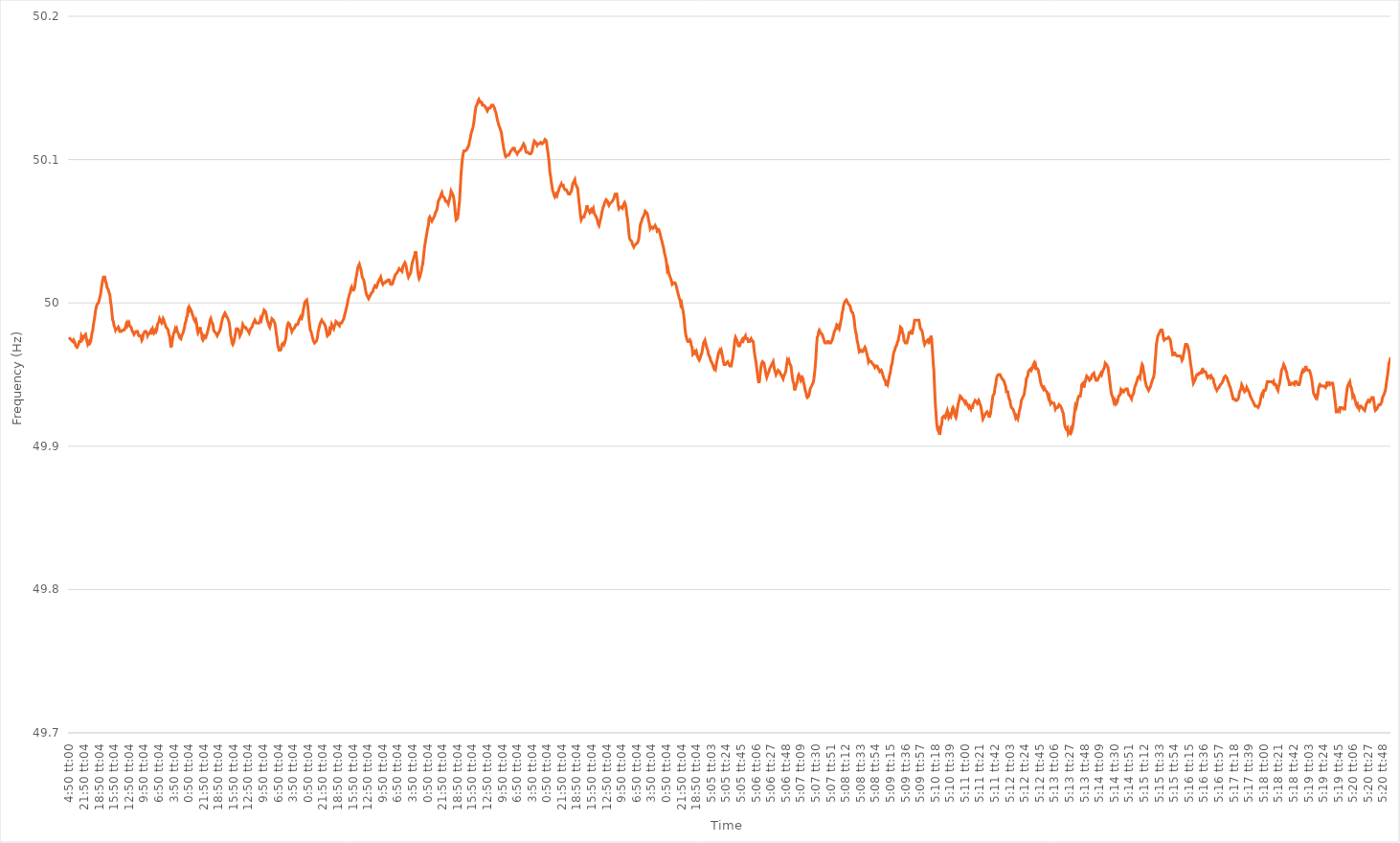
| Category | Series 0 |
|---|---|
| 0.20138888888888887 | 49.976 |
| 0.20140046296296296 | 49.975 |
| 0.20141203703703703 | 49.975 |
| 0.2014236111111111 | 49.974 |
| 0.2014351851851852 | 49.974 |
| 0.243101851851852 | 49.973 |
| 0.284768518518519 | 49.974 |
| 0.326435185185185 | 49.973 |
| 0.368101851851852 | 49.972 |
| 0.409768518518519 | 49.97 |
| 0.451435185185185 | 49.97 |
| 0.493101851851852 | 49.969 |
| 0.534768518518518 | 49.97 |
| 0.576435185185185 | 49.971 |
| 0.618101851851852 | 49.973 |
| 0.659768518518518 | 49.973 |
| 0.701435185185185 | 49.973 |
| 0.743101851851852 | 49.977 |
| 0.784768518518519 | 49.976 |
| 0.826435185185185 | 49.975 |
| 0.868101851851852 | 49.976 |
| 0.909768518518519 | 49.977 |
| 0.951435185185185 | 49.977 |
| 0.993101851851852 | 49.978 |
| 1900-01-01 00:50:04 | 49.975 |
| 1900-01-01 01:50:04 | 49.973 |
| 1900-01-01 02:50:04 | 49.971 |
| 1900-01-01 03:50:04 | 49.971 |
| 1900-01-01 04:50:04 | 49.973 |
| 1900-01-01 05:50:04 | 49.972 |
| 1900-01-01 06:50:04 | 49.973 |
| 1900-01-01 07:50:04 | 49.976 |
| 1900-01-01 08:50:04 | 49.979 |
| 1900-01-01 09:50:04 | 49.981 |
| 1900-01-01 10:50:04 | 49.985 |
| 1900-01-01 11:50:04 | 49.988 |
| 1900-01-01 12:50:04 | 49.991 |
| 1900-01-01 13:50:04 | 49.995 |
| 1900-01-01 14:50:04 | 49.997 |
| 1900-01-01 15:50:04 | 49.999 |
| 1900-01-01 16:50:04 | 49.999 |
| 1900-01-01 17:50:04 | 50 |
| 1900-01-01 18:50:04 | 50.002 |
| 1900-01-01 19:50:04 | 50.002 |
| 1900-01-01 20:50:04 | 50.006 |
| 1900-01-01 21:50:04 | 50.01 |
| 1900-01-01 22:50:04 | 50.013 |
| 1900-01-01 23:50:04 | 50.016 |
| 1900-01-02 00:50:04 | 50.018 |
| 1900-01-02 01:50:04 | 50.018 |
| 1900-01-02 02:50:04 | 50.018 |
| 1900-01-02 03:50:04 | 50.015 |
| 1900-01-02 04:50:04 | 50.014 |
| 1900-01-02 05:50:04 | 50.011 |
| 1900-01-02 06:50:04 | 50.01 |
| 1900-01-02 07:50:04 | 50.009 |
| 1900-01-02 08:50:04 | 50.007 |
| 1900-01-02 09:50:04 | 50.006 |
| 1900-01-02 10:50:04 | 50.001 |
| 1900-01-02 11:50:04 | 49.998 |
| 1900-01-02 12:50:04 | 49.993 |
| 1900-01-02 13:50:04 | 49.988 |
| 1900-01-02 14:50:04 | 49.987 |
| 1900-01-02 15:50:04 | 49.984 |
| 1900-01-02 16:50:04 | 49.983 |
| 1900-01-02 17:50:04 | 49.981 |
| 1900-01-02 18:50:04 | 49.982 |
| 1900-01-02 19:50:04 | 49.982 |
| 1900-01-02 20:50:04 | 49.982 |
| 1900-01-02 21:50:04 | 49.983 |
| 1900-01-02 22:50:04 | 49.982 |
| 1900-01-02 23:50:04 | 49.98 |
| 1900-01-03 00:50:04 | 49.98 |
| 1900-01-03 01:50:04 | 49.98 |
| 1900-01-03 02:50:04 | 49.98 |
| 1900-01-03 03:50:04 | 49.981 |
| 1900-01-03 04:50:04 | 49.981 |
| 1900-01-03 05:50:04 | 49.981 |
| 1900-01-03 06:50:04 | 49.982 |
| 1900-01-03 07:50:04 | 49.983 |
| 1900-01-03 08:50:04 | 49.985 |
| 1900-01-03 09:50:04 | 49.984 |
| 1900-01-03 10:50:04 | 49.986 |
| 1900-01-03 11:50:04 | 49.985 |
| 1900-01-03 12:50:04 | 49.986 |
| 1900-01-03 13:50:04 | 49.984 |
| 1900-01-03 14:50:04 | 49.984 |
| 1900-01-03 15:50:04 | 49.983 |
| 1900-01-03 16:50:04 | 49.981 |
| 1900-01-03 17:50:04 | 49.981 |
| 1900-01-03 18:50:04 | 49.979 |
| 1900-01-03 19:50:04 | 49.978 |
| 1900-01-03 20:50:04 | 49.979 |
| 1900-01-03 21:50:04 | 49.979 |
| 1900-01-03 22:50:04 | 49.98 |
| 1900-01-03 23:50:04 | 49.98 |
| 1900-01-04 00:50:04 | 49.98 |
| 1900-01-04 01:50:04 | 49.978 |
| 1900-01-04 02:50:04 | 49.977 |
| 1900-01-04 03:50:04 | 49.977 |
| 1900-01-04 04:50:04 | 49.977 |
| 1900-01-04 05:50:04 | 49.976 |
| 1900-01-04 06:50:04 | 49.974 |
| 1900-01-04 07:50:04 | 49.975 |
| 1900-01-04 08:50:04 | 49.978 |
| 1900-01-04 09:50:04 | 49.978 |
| 1900-01-04 10:50:04 | 49.98 |
| 1900-01-04 11:50:04 | 49.98 |
| 1900-01-04 12:50:04 | 49.98 |
| 1900-01-04 13:50:04 | 49.979 |
| 1900-01-04 14:50:04 | 49.977 |
| 1900-01-04 15:50:04 | 49.978 |
| 1900-01-04 16:50:04 | 49.978 |
| 1900-01-04 17:50:04 | 49.979 |
| 1900-01-04 18:50:04 | 49.98 |
| 1900-01-04 19:50:04 | 49.978 |
| 1900-01-04 20:50:04 | 49.981 |
| 1900-01-04 21:50:04 | 49.982 |
| 1900-01-04 22:50:04 | 49.98 |
| 1900-01-04 23:50:04 | 49.979 |
| 1900-01-05 00:50:04 | 49.979 |
| 1900-01-05 01:50:04 | 49.981 |
| 1900-01-05 02:50:04 | 49.98 |
| 1900-01-05 03:50:04 | 49.981 |
| 1900-01-05 04:50:04 | 49.985 |
| 1900-01-05 05:50:04 | 49.985 |
| 1900-01-05 06:50:04 | 49.987 |
| 1900-01-05 07:50:04 | 49.989 |
| 1900-01-05 08:50:04 | 49.988 |
| 1900-01-05 09:50:04 | 49.987 |
| 1900-01-05 10:50:04 | 49.986 |
| 1900-01-05 11:50:04 | 49.987 |
| 1900-01-05 12:50:04 | 49.989 |
| 1900-01-05 13:50:04 | 49.988 |
| 1900-01-05 14:50:04 | 49.986 |
| 1900-01-05 15:50:04 | 49.985 |
| 1900-01-05 16:50:04 | 49.983 |
| 1900-01-05 17:50:04 | 49.983 |
| 1900-01-05 18:50:04 | 49.982 |
| 1900-01-05 19:50:04 | 49.981 |
| 1900-01-05 20:50:04 | 49.978 |
| 1900-01-05 21:50:04 | 49.977 |
| 1900-01-05 22:50:04 | 49.973 |
| 1900-01-05 23:50:04 | 49.969 |
| 1900-01-06 00:50:04 | 49.971 |
| 1900-01-06 01:50:04 | 49.974 |
| 1900-01-06 02:50:04 | 49.977 |
| 1900-01-06 03:50:04 | 49.979 |
| 1900-01-06 04:50:04 | 49.98 |
| 1900-01-06 05:50:04 | 49.982 |
| 1900-01-06 06:50:04 | 49.981 |
| 1900-01-06 07:50:04 | 49.982 |
| 1900-01-06 08:50:04 | 49.98 |
| 1900-01-06 09:50:04 | 49.979 |
| 1900-01-06 10:50:04 | 49.978 |
| 1900-01-06 11:50:04 | 49.976 |
| 1900-01-06 12:50:04 | 49.976 |
| 1900-01-06 13:50:04 | 49.975 |
| 1900-01-06 14:50:04 | 49.977 |
| 1900-01-06 15:50:04 | 49.978 |
| 1900-01-06 16:50:04 | 49.979 |
| 1900-01-06 17:50:04 | 49.981 |
| 1900-01-06 18:50:04 | 49.983 |
| 1900-01-06 19:50:04 | 49.986 |
| 1900-01-06 20:50:04 | 49.987 |
| 1900-01-06 21:50:04 | 49.99 |
| 1900-01-06 22:50:04 | 49.991 |
| 1900-01-06 23:50:04 | 49.996 |
| 1900-01-07 00:50:04 | 49.997 |
| 1900-01-07 01:50:04 | 49.995 |
| 1900-01-07 02:50:04 | 49.996 |
| 1900-01-07 03:50:04 | 49.995 |
| 1900-01-07 04:50:04 | 49.994 |
| 1900-01-07 05:50:04 | 49.992 |
| 1900-01-07 06:50:04 | 49.991 |
| 1900-01-07 07:50:04 | 49.989 |
| 1900-01-07 08:50:04 | 49.989 |
| 1900-01-07 09:50:04 | 49.987 |
| 1900-01-07 10:50:04 | 49.988 |
| 1900-01-07 11:50:04 | 49.986 |
| 1900-01-07 12:50:04 | 49.981 |
| 1900-01-07 13:50:04 | 49.979 |
| 1900-01-07 14:50:04 | 49.98 |
| 1900-01-07 15:50:04 | 49.98 |
| 1900-01-07 16:50:04 | 49.983 |
| 1900-01-07 17:50:04 | 49.98 |
| 1900-01-07 18:50:04 | 49.979 |
| 1900-01-07 19:50:04 | 49.975 |
| 1900-01-07 20:50:04 | 49.974 |
| 1900-01-07 21:50:04 | 49.975 |
| 1900-01-07 22:50:04 | 49.977 |
| 1900-01-07 23:50:04 | 49.977 |
| 1900-01-08 00:50:04 | 49.976 |
| 1900-01-08 01:50:04 | 49.976 |
| 1900-01-08 02:50:04 | 49.979 |
| 1900-01-08 03:50:04 | 49.979 |
| 1900-01-08 04:50:04 | 49.983 |
| 1900-01-08 05:50:04 | 49.985 |
| 1900-01-08 06:50:04 | 49.988 |
| 1900-01-08 07:50:04 | 49.989 |
| 1900-01-08 08:50:04 | 49.987 |
| 1900-01-08 09:50:04 | 49.986 |
| 1900-01-08 10:50:04 | 49.985 |
| 1900-01-08 11:50:04 | 49.981 |
| 1900-01-08 12:50:04 | 49.98 |
| 1900-01-08 13:50:04 | 49.98 |
| 1900-01-08 14:50:04 | 49.979 |
| 1900-01-08 15:50:04 | 49.978 |
| 1900-01-08 16:50:04 | 49.977 |
| 1900-01-08 17:50:04 | 49.978 |
| 1900-01-08 18:50:04 | 49.978 |
| 1900-01-08 19:50:04 | 49.98 |
| 1900-01-08 20:50:04 | 49.981 |
| 1900-01-08 21:50:04 | 49.983 |
| 1900-01-08 22:50:04 | 49.986 |
| 1900-01-08 23:50:04 | 49.988 |
| 1900-01-09 00:50:04 | 49.99 |
| 1900-01-09 01:50:04 | 49.991 |
| 1900-01-09 02:50:04 | 49.992 |
| 1900-01-09 03:50:04 | 49.99 |
| 1900-01-09 04:50:04 | 49.992 |
| 1900-01-09 05:50:04 | 49.992 |
| 1900-01-09 06:50:04 | 49.99 |
| 1900-01-09 07:50:04 | 49.989 |
| 1900-01-09 08:50:04 | 49.989 |
| 1900-01-09 09:50:04 | 49.986 |
| 1900-01-09 10:50:04 | 49.982 |
| 1900-01-09 11:50:04 | 49.977 |
| 1900-01-09 12:50:04 | 49.975 |
| 1900-01-09 13:50:04 | 49.972 |
| 1900-01-09 14:50:04 | 49.971 |
| 1900-01-09 15:50:04 | 49.972 |
| 1900-01-09 16:50:04 | 49.974 |
| 1900-01-09 17:50:04 | 49.977 |
| 1900-01-09 18:50:04 | 49.979 |
| 1900-01-09 19:50:04 | 49.982 |
| 1900-01-09 20:50:04 | 49.982 |
| 1900-01-09 21:50:04 | 49.982 |
| 1900-01-09 22:50:04 | 49.981 |
| 1900-01-09 23:50:04 | 49.98 |
| 1900-01-10 00:50:04 | 49.977 |
| 1900-01-10 01:50:04 | 49.977 |
| 1900-01-10 02:50:04 | 49.979 |
| 1900-01-10 03:50:04 | 49.982 |
| 1900-01-10 04:50:04 | 49.985 |
| 1900-01-10 05:50:04 | 49.984 |
| 1900-01-10 06:50:04 | 49.983 |
| 1900-01-10 07:50:04 | 49.983 |
| 1900-01-10 08:50:04 | 49.983 |
| 1900-01-10 09:50:04 | 49.982 |
| 1900-01-10 10:50:04 | 49.982 |
| 1900-01-10 11:50:04 | 49.981 |
| 1900-01-10 12:50:04 | 49.98 |
| 1900-01-10 13:50:04 | 49.979 |
| 1900-01-10 14:50:04 | 49.979 |
| 1900-01-10 15:50:04 | 49.982 |
| 1900-01-10 16:50:04 | 49.982 |
| 1900-01-10 17:50:04 | 49.983 |
| 1900-01-10 18:50:04 | 49.985 |
| 1900-01-10 19:50:04 | 49.986 |
| 1900-01-10 20:50:04 | 49.987 |
| 1900-01-10 21:50:04 | 49.988 |
| 1900-01-10 22:50:04 | 49.988 |
| 1900-01-10 23:50:04 | 49.986 |
| 1900-01-11 00:50:04 | 49.986 |
| 1900-01-11 01:50:04 | 49.986 |
| 1900-01-11 02:50:04 | 49.986 |
| 1900-01-11 03:50:04 | 49.986 |
| 1900-01-11 04:50:04 | 49.987 |
| 1900-01-11 05:50:04 | 49.989 |
| 1900-01-11 06:50:04 | 49.988 |
| 1900-01-11 07:50:04 | 49.99 |
| 1900-01-11 08:50:04 | 49.992 |
| 1900-01-11 09:50:04 | 49.993 |
| 1900-01-11 10:50:04 | 49.995 |
| 1900-01-11 11:50:04 | 49.995 |
| 1900-01-11 12:50:04 | 49.994 |
| 1900-01-11 13:50:04 | 49.992 |
| 1900-01-11 14:50:04 | 49.989 |
| 1900-01-11 15:50:04 | 49.987 |
| 1900-01-11 16:50:04 | 49.986 |
| 1900-01-11 17:50:04 | 49.984 |
| 1900-01-11 18:50:04 | 49.983 |
| 1900-01-11 19:50:04 | 49.985 |
| 1900-01-11 20:50:04 | 49.987 |
| 1900-01-11 21:50:04 | 49.989 |
| 1900-01-11 22:50:04 | 49.989 |
| 1900-01-11 23:50:04 | 49.988 |
| 1900-01-12 00:50:04 | 49.987 |
| 1900-01-12 01:50:04 | 49.986 |
| 1900-01-12 02:50:04 | 49.983 |
| 1900-01-12 03:50:04 | 49.979 |
| 1900-01-12 04:50:04 | 49.976 |
| 1900-01-12 05:50:04 | 49.971 |
| 1900-01-12 06:50:04 | 49.969 |
| 1900-01-12 07:50:04 | 49.967 |
| 1900-01-12 08:50:04 | 49.967 |
| 1900-01-12 09:50:04 | 49.967 |
| 1900-01-12 10:50:04 | 49.968 |
| 1900-01-12 11:50:04 | 49.971 |
| 1900-01-12 12:50:04 | 49.971 |
| 1900-01-12 13:50:04 | 49.972 |
| 1900-01-12 14:50:04 | 49.971 |
| 1900-01-12 15:50:04 | 49.972 |
| 1900-01-12 16:50:04 | 49.974 |
| 1900-01-12 17:50:04 | 49.977 |
| 1900-01-12 18:50:04 | 49.982 |
| 1900-01-12 19:50:04 | 49.985 |
| 1900-01-12 20:50:04 | 49.986 |
| 1900-01-12 21:50:04 | 49.986 |
| 1900-01-12 22:50:04 | 49.985 |
| 1900-01-12 23:50:04 | 49.983 |
| 1900-01-13 00:50:04 | 49.982 |
| 1900-01-13 01:50:04 | 49.98 |
| 1900-01-13 02:50:04 | 49.981 |
| 1900-01-13 03:50:04 | 49.981 |
| 1900-01-13 04:50:04 | 49.982 |
| 1900-01-13 05:50:04 | 49.982 |
| 1900-01-13 06:50:04 | 49.984 |
| 1900-01-13 07:50:04 | 49.985 |
| 1900-01-13 08:50:04 | 49.985 |
| 1900-01-13 09:50:04 | 49.985 |
| 1900-01-13 10:50:04 | 49.986 |
| 1900-01-13 11:50:04 | 49.988 |
| 1900-01-13 12:50:04 | 49.989 |
| 1900-01-13 13:50:04 | 49.99 |
| 1900-01-13 14:50:04 | 49.988 |
| 1900-01-13 15:50:04 | 49.99 |
| 1900-01-13 16:50:04 | 49.991 |
| 1900-01-13 17:50:04 | 49.995 |
| 1900-01-13 18:50:04 | 49.997 |
| 1900-01-13 19:50:04 | 50 |
| 1900-01-13 20:50:04 | 50.001 |
| 1900-01-13 21:50:04 | 50.001 |
| 1900-01-13 22:50:04 | 50.002 |
| 1900-01-13 23:50:04 | 49.999 |
| 1900-01-14 00:50:04 | 49.995 |
| 1900-01-14 01:50:04 | 49.989 |
| 1900-01-14 02:50:04 | 49.985 |
| 1900-01-14 03:50:04 | 49.981 |
| 1900-01-14 04:50:04 | 49.98 |
| 1900-01-14 05:50:04 | 49.978 |
| 1900-01-14 06:50:04 | 49.976 |
| 1900-01-14 07:50:04 | 49.974 |
| 1900-01-14 08:50:04 | 49.973 |
| 1900-01-14 09:50:04 | 49.972 |
| 1900-01-14 10:50:04 | 49.972 |
| 1900-01-14 11:50:04 | 49.973 |
| 1900-01-14 12:50:04 | 49.974 |
| 1900-01-14 13:50:04 | 49.976 |
| 1900-01-14 14:50:04 | 49.98 |
| 1900-01-14 15:50:04 | 49.982 |
| 1900-01-14 16:50:04 | 49.984 |
| 1900-01-14 17:50:04 | 49.986 |
| 1900-01-14 18:50:04 | 49.987 |
| 1900-01-14 19:50:04 | 49.988 |
| 1900-01-14 20:50:04 | 49.987 |
| 1900-01-14 21:50:04 | 49.987 |
| 1900-01-14 22:50:04 | 49.986 |
| 1900-01-14 23:50:04 | 49.985 |
| 1900-01-15 00:50:04 | 49.984 |
| 1900-01-15 01:50:04 | 49.982 |
| 1900-01-15 02:50:04 | 49.979 |
| 1900-01-15 03:50:04 | 49.977 |
| 1900-01-15 04:50:04 | 49.977 |
| 1900-01-15 05:50:04 | 49.978 |
| 1900-01-15 06:50:04 | 49.981 |
| 1900-01-15 07:50:04 | 49.98 |
| 1900-01-15 08:50:04 | 49.982 |
| 1900-01-15 09:50:04 | 49.985 |
| 1900-01-15 10:50:04 | 49.984 |
| 1900-01-15 11:50:04 | 49.983 |
| 1900-01-15 12:50:04 | 49.982 |
| 1900-01-15 13:50:04 | 49.984 |
| 1900-01-15 14:50:04 | 49.985 |
| 1900-01-15 15:50:04 | 49.987 |
| 1900-01-15 16:50:04 | 49.987 |
| 1900-01-15 17:50:04 | 49.986 |
| 1900-01-15 18:50:04 | 49.985 |
| 1900-01-15 19:50:04 | 49.985 |
| 1900-01-15 20:50:04 | 49.984 |
| 1900-01-15 21:50:04 | 49.986 |
| 1900-01-15 22:50:04 | 49.986 |
| 1900-01-15 23:50:04 | 49.986 |
| 1900-01-16 00:50:04 | 49.986 |
| 1900-01-16 01:50:04 | 49.988 |
| 1900-01-16 02:50:04 | 49.989 |
| 1900-01-16 03:50:04 | 49.991 |
| 1900-01-16 04:50:04 | 49.993 |
| 1900-01-16 05:50:04 | 49.995 |
| 1900-01-16 06:50:04 | 49.997 |
| 1900-01-16 07:50:04 | 49.999 |
| 1900-01-16 08:50:04 | 50.002 |
| 1900-01-16 09:50:04 | 50.004 |
| 1900-01-16 10:50:04 | 50.006 |
| 1900-01-16 11:50:04 | 50.007 |
| 1900-01-16 12:50:04 | 50.01 |
| 1900-01-16 13:50:04 | 50.011 |
| 1900-01-16 14:50:04 | 50.009 |
| 1900-01-16 15:50:04 | 50.009 |
| 1900-01-16 16:50:04 | 50.009 |
| 1900-01-16 17:50:04 | 50.01 |
| 1900-01-16 18:50:04 | 50.013 |
| 1900-01-16 19:50:04 | 50.017 |
| 1900-01-16 20:50:04 | 50.019 |
| 1900-01-16 21:50:04 | 50.022 |
| 1900-01-16 22:50:04 | 50.025 |
| 1900-01-16 23:50:04 | 50.026 |
| 1900-01-17 00:50:04 | 50.027 |
| 1900-01-17 01:50:04 | 50.025 |
| 1900-01-17 02:50:04 | 50.024 |
| 1900-01-17 03:50:04 | 50.021 |
| 1900-01-17 04:50:04 | 50.018 |
| 1900-01-17 05:50:04 | 50.018 |
| 1900-01-17 06:50:04 | 50.016 |
| 1900-01-17 07:50:04 | 50.014 |
| 1900-01-17 08:50:04 | 50.011 |
| 1900-01-17 09:50:04 | 50.008 |
| 1900-01-17 10:50:04 | 50.006 |
| 1900-01-17 11:50:04 | 50.005 |
| 1900-01-17 12:50:04 | 50.005 |
| 1900-01-17 13:50:04 | 50.003 |
| 1900-01-17 14:50:04 | 50.004 |
| 1900-01-17 15:50:04 | 50.005 |
| 1900-01-17 16:50:04 | 50.006 |
| 1900-01-17 17:50:04 | 50.007 |
| 1900-01-17 18:50:04 | 50.007 |
| 1900-01-17 19:50:04 | 50.008 |
| 1900-01-17 20:50:04 | 50.01 |
| 1900-01-17 21:50:04 | 50.011 |
| 1900-01-17 22:50:04 | 50.012 |
| 1900-01-17 23:50:04 | 50.012 |
| 1900-01-18 00:50:04 | 50.011 |
| 1900-01-18 01:50:04 | 50.012 |
| 1900-01-18 02:50:04 | 50.014 |
| 1900-01-18 03:50:04 | 50.015 |
| 1900-01-18 04:50:04 | 50.016 |
| 1900-01-18 05:50:04 | 50.017 |
| 1900-01-18 06:50:04 | 50.018 |
| 1900-01-18 07:50:04 | 50.016 |
| 1900-01-18 08:50:04 | 50.014 |
| 1900-01-18 09:50:04 | 50.013 |
| 1900-01-18 10:50:04 | 50.014 |
| 1900-01-18 11:50:04 | 50.014 |
| 1900-01-18 12:50:04 | 50.014 |
| 1900-01-18 13:50:04 | 50.015 |
| 1900-01-18 14:50:04 | 50.015 |
| 1900-01-18 15:50:04 | 50.015 |
| 1900-01-18 16:50:04 | 50.016 |
| 1900-01-18 17:50:04 | 50.016 |
| 1900-01-18 18:50:04 | 50.016 |
| 1900-01-18 19:50:04 | 50.016 |
| 1900-01-18 20:50:04 | 50.013 |
| 1900-01-18 21:50:04 | 50.013 |
| 1900-01-18 22:50:04 | 50.013 |
| 1900-01-18 23:50:04 | 50.014 |
| 1900-01-19 00:50:04 | 50.016 |
| 1900-01-19 01:50:04 | 50.017 |
| 1900-01-19 02:50:04 | 50.019 |
| 1900-01-19 03:50:04 | 50.02 |
| 1900-01-19 04:50:04 | 50.02 |
| 1900-01-19 05:50:04 | 50.021 |
| 1900-01-19 06:50:04 | 50.022 |
| 1900-01-19 07:50:04 | 50.023 |
| 1900-01-19 08:50:04 | 50.024 |
| 1900-01-19 09:50:04 | 50.024 |
| 1900-01-19 10:50:04 | 50.023 |
| 1900-01-19 11:50:04 | 50.023 |
| 1900-01-19 12:50:04 | 50.022 |
| 1900-01-19 13:50:04 | 50.025 |
| 1900-01-19 14:50:04 | 50.025 |
| 1900-01-19 15:50:04 | 50.027 |
| 1900-01-19 16:50:04 | 50.028 |
| 1900-01-19 17:50:04 | 50.027 |
| 1900-01-19 18:50:04 | 50.025 |
| 1900-01-19 19:50:04 | 50.022 |
| 1900-01-19 20:50:04 | 50.02 |
| 1900-01-19 21:50:04 | 50.018 |
| 1900-01-19 22:50:04 | 50.019 |
| 1900-01-19 23:50:04 | 50.019 |
| 1900-01-20 00:50:04 | 50.021 |
| 1900-01-20 01:50:04 | 50.024 |
| 1900-01-20 02:50:04 | 50.027 |
| 1900-01-20 03:50:04 | 50.029 |
| 1900-01-20 04:50:04 | 50.029 |
| 1900-01-20 05:50:04 | 50.032 |
| 1900-01-20 06:50:04 | 50.034 |
| 1900-01-20 07:50:04 | 50.036 |
| 1900-01-20 08:50:04 | 50.033 |
| 1900-01-20 09:50:04 | 50.029 |
| 1900-01-20 10:50:04 | 50.023 |
| 1900-01-20 11:50:04 | 50.019 |
| 1900-01-20 12:50:04 | 50.017 |
| 1900-01-20 13:50:04 | 50.018 |
| 1900-01-20 14:50:04 | 50.02 |
| 1900-01-20 15:50:04 | 50.022 |
| 1900-01-20 16:50:04 | 50.025 |
| 1900-01-20 17:50:04 | 50.027 |
| 1900-01-20 18:50:04 | 50.031 |
| 1900-01-20 19:50:04 | 50.036 |
| 1900-01-20 20:50:04 | 50.04 |
| 1900-01-20 21:50:04 | 50.043 |
| 1900-01-20 22:50:04 | 50.046 |
| 1900-01-20 23:50:04 | 50.049 |
| 1900-01-21 00:50:04 | 50.052 |
| 1900-01-21 01:50:04 | 50.054 |
| 1900-01-21 02:50:04 | 50.059 |
| 1900-01-21 03:50:04 | 50.06 |
| 1900-01-21 04:50:04 | 50.059 |
| 1900-01-21 05:50:04 | 50.059 |
| 1900-01-21 06:50:04 | 50.057 |
| 1900-01-21 07:50:04 | 50.058 |
| 1900-01-21 08:50:04 | 50.059 |
| 1900-01-21 09:50:04 | 50.06 |
| 1900-01-21 10:50:04 | 50.061 |
| 1900-01-21 11:50:04 | 50.063 |
| 1900-01-21 12:50:04 | 50.064 |
| 1900-01-21 13:50:04 | 50.065 |
| 1900-01-21 14:50:04 | 50.068 |
| 1900-01-21 15:50:04 | 50.071 |
| 1900-01-21 16:50:04 | 50.072 |
| 1900-01-21 17:50:04 | 50.073 |
| 1900-01-21 18:50:04 | 50.074 |
| 1900-01-21 19:50:04 | 50.076 |
| 1900-01-21 20:50:04 | 50.077 |
| 1900-01-21 21:50:04 | 50.075 |
| 1900-01-21 22:50:04 | 50.074 |
| 1900-01-21 23:50:04 | 50.074 |
| 1900-01-22 00:50:04 | 50.073 |
| 1900-01-22 01:50:04 | 50.071 |
| 1900-01-22 02:50:04 | 50.071 |
| 1900-01-22 03:50:04 | 50.071 |
| 1900-01-22 04:50:04 | 50.07 |
| 1900-01-22 05:50:04 | 50.069 |
| 1900-01-22 06:50:04 | 50.069 |
| 1900-01-22 07:50:04 | 50.073 |
| 1900-01-22 08:50:04 | 50.075 |
| 1900-01-22 09:50:04 | 50.078 |
| 1900-01-22 10:50:04 | 50.077 |
| 1900-01-22 11:50:04 | 50.077 |
| 1900-01-22 12:50:04 | 50.075 |
| 1900-01-22 13:50:04 | 50.072 |
| 1900-01-22 14:50:04 | 50.068 |
| 1900-01-22 15:50:04 | 50.062 |
| 1900-01-22 16:50:04 | 50.058 |
| 1900-01-22 17:50:04 | 50.058 |
| 1900-01-22 18:50:04 | 50.059 |
| 1900-01-22 19:50:04 | 50.062 |
| 1900-01-22 20:50:04 | 50.067 |
| 1900-01-22 21:50:04 | 50.072 |
| 1900-01-22 22:50:04 | 50.081 |
| 1900-01-22 23:50:04 | 50.09 |
| 1900-01-23 00:50:04 | 50.096 |
| 1900-01-23 01:50:04 | 50.101 |
| 1900-01-23 02:50:04 | 50.104 |
| 1900-01-23 03:50:04 | 50.106 |
| 1900-01-23 04:50:04 | 50.106 |
| 1900-01-23 05:50:04 | 50.106 |
| 1900-01-23 06:50:04 | 50.106 |
| 1900-01-23 07:50:04 | 50.107 |
| 1900-01-23 08:50:04 | 50.108 |
| 1900-01-23 09:50:04 | 50.109 |
| 1900-01-23 10:50:04 | 50.11 |
| 1900-01-23 11:50:04 | 50.113 |
| 1900-01-23 12:50:04 | 50.115 |
| 1900-01-23 13:50:04 | 50.118 |
| 1900-01-23 14:50:04 | 50.118 |
| 1900-01-23 15:50:04 | 50.121 |
| 1900-01-23 16:50:04 | 50.123 |
| 1900-01-23 17:50:04 | 50.126 |
| 1900-01-23 18:50:04 | 50.13 |
| 1900-01-23 19:50:04 | 50.134 |
| 1900-01-23 20:50:04 | 50.137 |
| 1900-01-23 21:50:04 | 50.138 |
| 1900-01-23 22:50:04 | 50.139 |
| 1900-01-23 23:50:04 | 50.141 |
| 1900-01-24 00:50:04 | 50.142 |
| 1900-01-24 01:50:04 | 50.141 |
| 1900-01-24 02:50:04 | 50.14 |
| 1900-01-24 03:50:04 | 50.14 |
| 1900-01-24 04:50:04 | 50.14 |
| 1900-01-24 05:50:04 | 50.138 |
| 1900-01-24 06:50:04 | 50.138 |
| 1900-01-24 07:50:04 | 50.138 |
| 1900-01-24 08:50:04 | 50.138 |
| 1900-01-24 09:50:04 | 50.137 |
| 1900-01-24 10:50:04 | 50.136 |
| 1900-01-24 11:50:04 | 50.135 |
| 1900-01-24 12:50:04 | 50.134 |
| 1900-01-24 13:50:04 | 50.135 |
| 1900-01-24 14:50:04 | 50.136 |
| 1900-01-24 15:50:04 | 50.136 |
| 1900-01-24 16:50:04 | 50.136 |
| 1900-01-24 17:50:04 | 50.137 |
| 1900-01-24 18:50:04 | 50.138 |
| 1900-01-24 19:50:04 | 50.138 |
| 1900-01-24 20:50:04 | 50.138 |
| 1900-01-24 21:50:04 | 50.138 |
| 1900-01-24 22:50:04 | 50.136 |
| 1900-01-24 23:50:04 | 50.134 |
| 1900-01-25 00:50:04 | 50.133 |
| 1900-01-25 01:50:04 | 50.133 |
| 1900-01-25 02:50:04 | 50.128 |
| 1900-01-25 03:50:04 | 50.126 |
| 1900-01-25 04:50:04 | 50.124 |
| 1900-01-25 05:50:04 | 50.123 |
| 1900-01-25 06:50:04 | 50.123 |
| 1900-01-25 07:50:04 | 50.12 |
| 1900-01-25 08:50:04 | 50.118 |
| 1900-01-25 09:50:04 | 50.114 |
| 1900-01-25 10:50:04 | 50.111 |
| 1900-01-25 11:50:04 | 50.108 |
| 1900-01-25 12:50:04 | 50.106 |
| 1900-01-25 13:50:04 | 50.103 |
| 1900-01-25 14:50:04 | 50.102 |
| 1900-01-25 15:50:04 | 50.102 |
| 1900-01-25 16:50:04 | 50.103 |
| 1900-01-25 17:50:04 | 50.103 |
| 1900-01-25 18:50:04 | 50.103 |
| 1900-01-25 19:50:04 | 50.104 |
| 1900-01-25 20:50:04 | 50.104 |
| 1900-01-25 21:50:04 | 50.106 |
| 1900-01-25 22:50:04 | 50.106 |
| 1900-01-25 23:50:04 | 50.107 |
| 1900-01-26 00:50:04 | 50.108 |
| 1900-01-26 01:50:04 | 50.108 |
| 1900-01-26 02:50:04 | 50.108 |
| 1900-01-26 03:50:04 | 50.106 |
| 1900-01-26 04:50:04 | 50.106 |
| 1900-01-26 05:50:04 | 50.105 |
| 1900-01-26 06:50:04 | 50.104 |
| 1900-01-26 07:50:04 | 50.105 |
| 1900-01-26 08:50:04 | 50.105 |
| 1900-01-26 09:50:04 | 50.106 |
| 1900-01-26 10:50:04 | 50.106 |
| 1900-01-26 11:50:04 | 50.107 |
| 1900-01-26 12:50:04 | 50.108 |
| 1900-01-26 13:50:04 | 50.109 |
| 1900-01-26 14:50:04 | 50.109 |
| 1900-01-26 15:50:04 | 50.111 |
| 1900-01-26 16:50:04 | 50.11 |
| 1900-01-26 17:50:04 | 50.109 |
| 1900-01-26 18:50:04 | 50.106 |
| 1900-01-26 19:50:04 | 50.105 |
| 1900-01-26 20:50:04 | 50.105 |
| 1900-01-26 21:50:04 | 50.105 |
| 1900-01-26 22:50:04 | 50.105 |
| 1900-01-26 23:50:04 | 50.104 |
| 1900-01-27 00:50:04 | 50.104 |
| 1900-01-27 01:50:04 | 50.104 |
| 1900-01-27 02:50:04 | 50.104 |
| 1900-01-27 03:50:04 | 50.106 |
| 1900-01-27 04:50:04 | 50.109 |
| 1900-01-27 05:50:04 | 50.111 |
| 1900-01-27 06:50:04 | 50.113 |
| 1900-01-27 07:50:04 | 50.113 |
| 1900-01-27 08:50:04 | 50.112 |
| 1900-01-27 09:50:04 | 50.112 |
| 1900-01-27 10:50:04 | 50.11 |
| 1900-01-27 11:50:04 | 50.111 |
| 1900-01-27 12:50:04 | 50.111 |
| 1900-01-27 13:50:04 | 50.111 |
| 1900-01-27 14:50:04 | 50.111 |
| 1900-01-27 15:50:04 | 50.112 |
| 1900-01-27 16:50:04 | 50.112 |
| 1900-01-27 17:50:04 | 50.111 |
| 1900-01-27 18:50:04 | 50.111 |
| 1900-01-27 19:50:04 | 50.112 |
| 1900-01-27 20:50:04 | 50.113 |
| 1900-01-27 21:50:04 | 50.114 |
| 1900-01-27 22:50:04 | 50.114 |
| 1900-01-27 23:50:04 | 50.113 |
| 1900-01-28 00:50:04 | 50.109 |
| 1900-01-28 01:50:04 | 50.109 |
| 1900-01-28 02:50:04 | 50.102 |
| 1900-01-28 03:50:04 | 50.097 |
| 1900-01-28 04:50:04 | 50.091 |
| 1900-01-28 05:50:04 | 50.088 |
| 1900-01-28 06:50:04 | 50.084 |
| 1900-01-28 07:50:04 | 50.081 |
| 1900-01-28 08:50:04 | 50.078 |
| 1900-01-28 09:50:04 | 50.077 |
| 1900-01-28 10:50:04 | 50.075 |
| 1900-01-28 11:50:04 | 50.074 |
| 1900-01-28 12:50:04 | 50.075 |
| 1900-01-28 13:50:04 | 50.076 |
| 1900-01-28 14:50:04 | 50.075 |
| 1900-01-28 15:50:04 | 50.077 |
| 1900-01-28 16:50:04 | 50.078 |
| 1900-01-28 17:50:04 | 50.08 |
| 1900-01-28 18:50:04 | 50.081 |
| 1900-01-28 19:50:04 | 50.082 |
| 1900-01-28 20:50:04 | 50.083 |
| 1900-01-28 21:50:04 | 50.081 |
| 1900-01-28 22:50:04 | 50.083 |
| 1900-01-28 23:50:04 | 50.081 |
| 1900-01-29 00:50:04 | 50.081 |
| 1900-01-29 01:50:04 | 50.079 |
| 1900-01-29 02:50:04 | 50.079 |
| 1900-01-29 03:50:04 | 50.079 |
| 1900-01-29 04:50:04 | 50.079 |
| 1900-01-29 05:50:04 | 50.077 |
| 1900-01-29 06:50:04 | 50.076 |
| 1900-01-29 07:50:04 | 50.076 |
| 1900-01-29 08:50:04 | 50.076 |
| 1900-01-29 09:50:04 | 50.076 |
| 1900-01-29 10:50:04 | 50.078 |
| 1900-01-29 11:50:04 | 50.08 |
| 1900-01-29 12:50:04 | 50.083 |
| 1900-01-29 13:50:04 | 50.083 |
| 1900-01-29 14:50:04 | 50.085 |
| 1900-01-29 15:50:04 | 50.086 |
| 1900-01-29 16:50:04 | 50.083 |
| 1900-01-29 17:50:04 | 50.083 |
| 1900-01-29 18:50:04 | 50.081 |
| 1900-01-29 19:50:04 | 50.08 |
| 1900-01-29 20:50:04 | 50.075 |
| 1900-01-29 21:50:04 | 50.07 |
| 1900-01-29 22:50:04 | 50.066 |
| 1900-01-29 23:50:04 | 50.061 |
| 1900-01-30 00:50:04 | 50.058 |
| 1900-01-30 01:50:04 | 50.059 |
| 1900-01-30 02:50:04 | 50.06 |
| 1900-01-30 03:50:04 | 50.06 |
| 1900-01-30 04:50:04 | 50.06 |
| 1900-01-30 05:50:04 | 50.062 |
| 1900-01-30 06:50:04 | 50.063 |
| 1900-01-30 07:50:04 | 50.065 |
| 1900-01-30 08:50:04 | 50.068 |
| 1900-01-30 09:50:04 | 50.066 |
| 1900-01-30 10:50:04 | 50.066 |
| 1900-01-30 11:50:04 | 50.064 |
| 1900-01-30 12:50:04 | 50.063 |
| 1900-01-30 13:50:04 | 50.064 |
| 1900-01-30 14:50:04 | 50.065 |
| 1900-01-30 15:50:04 | 50.064 |
| 1900-01-30 16:50:04 | 50.064 |
| 1900-01-30 17:50:04 | 50.066 |
| 1900-01-30 18:50:04 | 50.063 |
| 1900-01-30 19:50:04 | 50.062 |
| 1900-01-30 20:50:04 | 50.061 |
| 1900-01-30 21:50:04 | 50.06 |
| 1900-01-30 22:50:04 | 50.059 |
| 1900-01-30 23:50:04 | 50.057 |
| 1900-01-31 00:50:04 | 50.055 |
| 1900-01-31 01:50:04 | 50.054 |
| 1900-01-31 02:50:04 | 50.056 |
| 1900-01-31 03:50:04 | 50.058 |
| 1900-01-31 04:50:04 | 50.06 |
| 1900-01-31 05:50:04 | 50.063 |
| 1900-01-31 06:50:04 | 50.065 |
| 1900-01-31 07:50:04 | 50.067 |
| 1900-01-31 08:50:04 | 50.068 |
| 1900-01-31 09:50:04 | 50.07 |
| 1900-01-31 10:50:04 | 50.071 |
| 1900-01-31 11:50:04 | 50.072 |
| 1900-01-31 12:50:04 | 50.072 |
| 1900-01-31 13:50:04 | 50.071 |
| 1900-01-31 14:50:04 | 50.069 |
| 1900-01-31 15:50:04 | 50.068 |
| 1900-01-31 16:50:04 | 50.069 |
| 1900-01-31 17:50:04 | 50.069 |
| 1900-01-31 18:50:04 | 50.07 |
| 1900-01-31 19:50:04 | 50.07 |
| 1900-01-31 20:50:04 | 50.071 |
| 1900-01-31 21:50:04 | 50.072 |
| 1900-01-31 22:50:04 | 50.073 |
| 1900-01-31 23:50:04 | 50.075 |
| 1900-02-01 00:50:04 | 50.076 |
| 1900-02-01 01:50:04 | 50.076 |
| 1900-02-01 02:50:04 | 50.076 |
| 1900-02-01 03:50:04 | 50.073 |
| 1900-02-01 04:50:04 | 50.068 |
| 1900-02-01 05:50:04 | 50.066 |
| 1900-02-01 06:50:04 | 50.067 |
| 1900-02-01 07:50:04 | 50.067 |
| 1900-02-01 08:50:04 | 50.067 |
| 1900-02-01 09:50:04 | 50.067 |
| 1900-02-01 10:50:04 | 50.066 |
| 1900-02-01 11:50:04 | 50.066 |
| 1900-02-01 12:50:04 | 50.069 |
| 1900-02-01 13:50:04 | 50.07 |
| 1900-02-01 14:50:04 | 50.069 |
| 1900-02-01 15:50:04 | 50.067 |
| 1900-02-01 16:50:04 | 50.062 |
| 1900-02-01 17:50:04 | 50.059 |
| 1900-02-01 18:50:04 | 50.055 |
| 1900-02-01 19:50:04 | 50.049 |
| 1900-02-01 20:50:04 | 50.045 |
| 1900-02-01 21:50:04 | 50.044 |
| 1900-02-01 22:50:04 | 50.044 |
| 1900-02-01 23:50:04 | 50.043 |
| 1900-02-02 00:50:04 | 50.041 |
| 1900-02-02 01:50:04 | 50.04 |
| 1900-02-02 02:50:04 | 50.039 |
| 1900-02-02 03:50:04 | 50.04 |
| 1900-02-02 04:50:04 | 50.04 |
| 1900-02-02 05:50:04 | 50.041 |
| 1900-02-02 06:50:04 | 50.041 |
| 1900-02-02 07:50:04 | 50.042 |
| 1900-02-02 08:50:04 | 50.043 |
| 1900-02-02 09:50:04 | 50.045 |
| 1900-02-02 10:50:04 | 50.049 |
| 1900-02-02 11:50:04 | 50.054 |
| 1900-02-02 12:50:04 | 50.056 |
| 1900-02-02 13:50:04 | 50.057 |
| 1900-02-02 14:50:04 | 50.059 |
| 1900-02-02 15:50:04 | 50.06 |
| 1900-02-02 16:50:04 | 50.061 |
| 1900-02-02 17:50:04 | 50.062 |
| 1900-02-02 18:50:04 | 50.064 |
| 1900-02-02 19:50:04 | 50.064 |
| 1900-02-02 20:50:04 | 50.063 |
| 1900-02-02 21:50:04 | 50.062 |
| 1900-02-02 22:50:04 | 50.06 |
| 1900-02-02 23:50:04 | 50.057 |
| 1900-02-03 00:50:04 | 50.055 |
| 1900-02-03 01:50:04 | 50.052 |
| 1900-02-03 02:50:04 | 50.053 |
| 1900-02-03 03:50:04 | 50.053 |
| 1900-02-03 04:50:04 | 50.053 |
| 1900-02-03 05:50:04 | 50.052 |
| 1900-02-03 06:50:04 | 50.052 |
| 1900-02-03 07:50:04 | 50.053 |
| 1900-02-03 08:50:04 | 50.054 |
| 1900-02-03 09:50:04 | 50.053 |
| 1900-02-03 10:50:04 | 50.052 |
| 1900-02-03 11:50:04 | 50.05 |
| 1900-02-03 12:50:04 | 50.05 |
| 1900-02-03 13:50:04 | 50.051 |
| 1900-02-03 14:50:04 | 50.05 |
| 1900-02-03 15:50:04 | 50.048 |
| 1900-02-03 16:50:04 | 50.048 |
| 1900-02-03 17:50:04 | 50.044 |
| 1900-02-03 18:50:04 | 50.042 |
| 1900-02-03 19:50:04 | 50.04 |
| 1900-02-03 20:50:04 | 50.038 |
| 1900-02-03 21:50:04 | 50.035 |
| 1900-02-03 22:50:04 | 50.033 |
| 1900-02-03 23:50:04 | 50.031 |
| 1900-02-04 00:50:04 | 50.028 |
| 1900-02-04 01:50:04 | 50.023 |
| 1900-02-04 02:50:04 | 50.024 |
| 1900-02-04 03:50:04 | 50.021 |
| 1900-02-04 04:50:04 | 50.021 |
| 1900-02-04 05:50:04 | 50.018 |
| 1900-02-04 06:50:04 | 50.017 |
| 1900-02-04 07:50:04 | 50.015 |
| 1900-02-04 08:50:04 | 50.013 |
| 1900-02-04 09:50:04 | 50.013 |
| 1900-02-04 10:50:04 | 50.014 |
| 1900-02-04 11:50:04 | 50.014 |
| 1900-02-04 12:50:04 | 50.014 |
| 1900-02-04 13:50:04 | 50.013 |
| 1900-02-04 14:50:04 | 50.013 |
| 1900-02-04 15:50:04 | 50.009 |
| 1900-02-04 16:50:04 | 50.007 |
| 1900-02-04 17:50:04 | 50.005 |
| 1900-02-04 18:50:04 | 50.003 |
| 1900-02-04 19:50:04 | 50.002 |
| 1900-02-04 20:50:04 | 49.999 |
| 1900-02-04 21:50:04 | 50 |
| 1900-02-04 22:50:04 | 49.997 |
| 1900-02-04 23:50:04 | 49.995 |
| 1900-02-05 00:50:04 | 49.992 |
| 1900-02-05 01:50:04 | 49.988 |
| 1900-02-05 02:50:04 | 49.982 |
| 1900-02-05 03:50:04 | 49.978 |
| 1900-02-05 04:50:04 | 49.976 |
| 1900-02-05 05:50:04 | 49.974 |
| 1900-02-05 06:50:04 | 49.973 |
| 1900-02-05 07:50:04 | 49.973 |
| 1900-02-05 08:50:04 | 49.973 |
| 1900-02-05 09:50:04 | 49.974 |
| 1900-02-05 10:50:04 | 49.973 |
| 1900-02-05 11:50:04 | 49.97 |
| 1900-02-05 12:50:04 | 49.969 |
| 1900-02-05 13:50:04 | 49.964 |
| 1900-02-05 14:50:04 | 49.964 |
| 1900-02-05 15:50:04 | 49.965 |
| 1900-02-05 16:50:04 | 49.966 |
| 1900-02-05 17:50:04 | 49.965 |
| 1900-02-05 18:50:04 | 49.966 |
| 1900-02-05 19:50:04 | 49.964 |
| 1900-02-05 20:50:04 | 49.962 |
| 1900-02-05 21:50:04 | 49.961 |
| 1900-02-05 22:50:04 | 49.96 |
| 1900-02-05 23:50:04 | 49.961 |
| 1900-02-06 00:50:04 | 49.963 |
| 1900-02-06 01:50:04 | 49.964 |
| 1900-02-06 02:50:04 | 49.966 |
| 1900-02-06 03:50:04 | 49.969 |
| 1900-02-06 04:50:04 | 49.972 |
| 1900-02-06 05:50:04 | 49.973 |
| 1900-02-06 06:50:04 | 49.974 |
| 1900-02-06 07:50:04 | 49.972 |
| 1900-02-06 08:50:04 | 49.97 |
| 1900-02-06 09:50:04 | 49.968 |
| 1900-02-06 10:50:04 | 49.967 |
| 1900-02-06 11:50:04 | 49.964 |
| 0.21180555555555555 | 49.964 |
| 0.21181712962962962 | 49.962 |
| 0.21182870370370369 | 49.96 |
| 0.21184027777777778 | 49.96 |
| 0.21185185185185185 | 49.958 |
| 0.2118634259259259 | 49.957 |
| 0.211875 | 49.955 |
| 0.21188657407407407 | 49.954 |
| 0.21189814814814814 | 49.955 |
| 0.21190972222222224 | 49.954 |
| 0.2119212962962963 | 49.957 |
| 0.21193287037037037 | 49.96 |
| 0.21194444444444446 | 49.962 |
| 0.21195601851851853 | 49.965 |
| 0.2119675925925926 | 49.966 |
| 0.2119791666666667 | 49.967 |
| 0.21199074074074076 | 49.966 |
| 0.21200231481481482 | 49.967 |
| 0.21201388888888886 | 49.967 |
| 0.21202546296296296 | 49.962 |
| 0.21203703703703702 | 49.959 |
| 0.2120486111111111 | 49.957 |
| 0.21206018518518518 | 49.957 |
| 0.21207175925925925 | 49.957 |
| 0.21208333333333332 | 49.958 |
| 0.2120949074074074 | 49.958 |
| 0.21210648148148148 | 49.959 |
| 0.21211805555555555 | 49.958 |
| 0.21212962962962964 | 49.957 |
| 0.2121412037037037 | 49.956 |
| 0.21215277777777777 | 49.956 |
| 0.21216435185185187 | 49.956 |
| 0.21217592592592593 | 49.959 |
| 0.2121875 | 49.961 |
| 0.2121990740740741 | 49.965 |
| 0.21221064814814816 | 49.969 |
| 0.21222222222222223 | 49.974 |
| 0.21223379629629632 | 49.976 |
| 0.21224537037037036 | 49.975 |
| 0.21225694444444443 | 49.974 |
| 0.2122685185185185 | 49.972 |
| 0.2122800925925926 | 49.97 |
| 0.21229166666666666 | 49.97 |
| 0.21230324074074072 | 49.97 |
| 0.21231481481481482 | 49.972 |
| 0.21232638888888888 | 49.973 |
| 0.21233796296296295 | 49.974 |
| 0.21234953703703704 | 49.972 |
| 0.2123611111111111 | 49.975 |
| 0.21237268518518518 | 49.975 |
| 0.21238425925925927 | 49.976 |
| 0.21239583333333334 | 49.977 |
| 0.2124074074074074 | 49.975 |
| 0.2124189814814815 | 49.975 |
| 0.21243055555555557 | 49.975 |
| 0.21244212962962963 | 49.973 |
| 0.21245370370370373 | 49.973 |
| 0.2124652777777778 | 49.973 |
| 0.21247685185185183 | 49.974 |
| 0.2124884259259259 | 49.975 |
| 0.2125 | 49.974 |
| 0.21251157407407406 | 49.974 |
| 0.21252314814814813 | 49.973 |
| 0.21253472222222222 | 49.968 |
| 0.2125462962962963 | 49.964 |
| 0.21255787037037036 | 49.961 |
| 0.21256944444444445 | 49.958 |
| 0.21258101851851852 | 49.954 |
| 0.21259259259259258 | 49.95 |
| 0.21260416666666668 | 49.946 |
| 0.21261574074074074 | 49.944 |
| 0.2126273148148148 | 49.948 |
| 0.2126388888888889 | 49.952 |
| 0.21265046296296297 | 49.956 |
| 0.21266203703703704 | 49.958 |
| 0.21267361111111113 | 49.959 |
| 0.2126851851851852 | 49.959 |
| 0.21269675925925927 | 49.958 |
| 0.21270833333333336 | 49.958 |
| 0.2127199074074074 | 49.953 |
| 0.21273148148148147 | 49.95 |
| 0.21274305555555553 | 49.948 |
| 0.21275462962962963 | 49.948 |
| 0.2127662037037037 | 49.951 |
| 0.21277777777777776 | 49.952 |
| 0.21278935185185185 | 49.954 |
| 0.21280092592592592 | 49.955 |
| 0.2128125 | 49.956 |
| 0.21282407407407408 | 49.957 |
| 0.21283564814814815 | 49.958 |
| 0.21284722222222222 | 49.959 |
| 0.2128587962962963 | 49.956 |
| 0.21287037037037038 | 49.953 |
| 0.21288194444444444 | 49.952 |
| 0.21289351851851854 | 49.95 |
| 0.2129050925925926 | 49.951 |
| 0.21291666666666667 | 49.952 |
| 0.21292824074074077 | 49.953 |
| 0.21293981481481483 | 49.953 |
| 0.2129513888888889 | 49.952 |
| 0.21296296296296294 | 49.951 |
| 0.21297453703703703 | 49.95 |
| 0.2129861111111111 | 49.949 |
| 0.21299768518518516 | 49.948 |
| 0.21300925925925926 | 49.947 |
| 0.21302083333333333 | 49.949 |
| 0.2130324074074074 | 49.95 |
| 0.2130439814814815 | 49.951 |
| 0.21305555555555555 | 49.953 |
| 0.21306712962962962 | 49.957 |
| 0.21307870370370371 | 49.96 |
| 0.21309027777777778 | 49.959 |
| 0.21310185185185185 | 49.96 |
| 0.21311342592592594 | 49.958 |
| 0.213125 | 49.958 |
| 0.21313657407407408 | 49.956 |
| 0.21314814814814817 | 49.952 |
| 0.21315972222222224 | 49.948 |
| 0.2131712962962963 | 49.945 |
| 0.2131828703703704 | 49.944 |
| 0.21319444444444444 | 49.939 |
| 0.2132060185185185 | 49.939 |
| 0.21321759259259257 | 49.942 |
| 0.21322916666666666 | 49.942 |
| 0.21324074074074073 | 49.945 |
| 0.2132523148148148 | 49.949 |
| 0.2132638888888889 | 49.95 |
| 0.21327546296296296 | 49.95 |
| 0.21328703703703702 | 49.948 |
| 0.21329861111111112 | 49.946 |
| 0.21331018518518519 | 49.947 |
| 0.21332175925925925 | 49.948 |
| 0.21333333333333335 | 49.947 |
| 0.2133449074074074 | 49.944 |
| 0.21335648148148148 | 49.942 |
| 0.21336805555555557 | 49.939 |
| 0.21337962962962964 | 49.938 |
| 0.2133912037037037 | 49.935 |
| 0.2134027777777778 | 49.934 |
| 0.21341435185185187 | 49.934 |
| 0.2134259259259259 | 49.935 |
| 0.21343749999999997 | 49.937 |
| 0.21344907407407407 | 49.94 |
| 0.21346064814814814 | 49.941 |
| 0.2134722222222222 | 49.942 |
| 0.2134837962962963 | 49.942 |
| 0.21349537037037036 | 49.944 |
| 0.21350694444444443 | 49.946 |
| 0.21351851851851852 | 49.95 |
| 0.2135300925925926 | 49.955 |
| 0.21354166666666666 | 49.961 |
| 0.21355324074074075 | 49.97 |
| 0.21356481481481482 | 49.976 |
| 0.21357638888888889 | 49.977 |
| 0.21358796296296298 | 49.98 |
| 0.21359953703703705 | 49.981 |
| 0.2136111111111111 | 49.98 |
| 0.2136226851851852 | 49.979 |
| 0.21363425925925927 | 49.979 |
| 0.21364583333333334 | 49.978 |
| 0.21365740740740743 | 49.976 |
| 0.21366898148148147 | 49.975 |
| 0.21368055555555554 | 49.973 |
| 0.2136921296296296 | 49.972 |
| 0.2137037037037037 | 49.972 |
| 0.21371527777777777 | 49.972 |
| 0.21372685185185183 | 49.973 |
| 0.21373842592592593 | 49.973 |
| 0.21375 | 49.973 |
| 0.21376157407407406 | 49.972 |
| 0.21377314814814816 | 49.972 |
| 0.21378472222222222 | 49.972 |
| 0.2137962962962963 | 49.972 |
| 0.21380787037037038 | 49.974 |
| 0.21381944444444445 | 49.976 |
| 0.21383101851851852 | 49.976 |
| 0.2138425925925926 | 49.98 |
| 0.21385416666666668 | 49.981 |
| 0.21386574074074075 | 49.982 |
| 0.21387731481481484 | 49.984 |
| 0.2138888888888889 | 49.983 |
| 0.21390046296296297 | 49.984 |
| 0.213912037037037 | 49.983 |
| 0.2139236111111111 | 49.982 |
| 0.21393518518518517 | 49.984 |
| 0.21394675925925924 | 49.987 |
| 0.21395833333333333 | 49.989 |
| 0.2139699074074074 | 49.993 |
| 0.21398148148148147 | 49.995 |
| 0.21399305555555556 | 49.998 |
| 0.21400462962962963 | 50 |
| 0.2140162037037037 | 50.001 |
| 0.2140277777777778 | 50.001 |
| 0.21403935185185186 | 50.002 |
| 0.21405092592592592 | 50.001 |
| 0.21406250000000002 | 50 |
| 0.21407407407407408 | 49.999 |
| 0.21408564814814815 | 49.999 |
| 0.21409722222222224 | 49.998 |
| 0.2141087962962963 | 49.996 |
| 0.21412037037037038 | 49.994 |
| 0.21413194444444442 | 49.994 |
| 0.2141435185185185 | 49.993 |
| 0.21415509259259258 | 49.991 |
| 0.21416666666666664 | 49.988 |
| 0.21417824074074074 | 49.983 |
| 0.2141898148148148 | 49.98 |
| 0.21420138888888887 | 49.978 |
| 0.21421296296296297 | 49.974 |
| 0.21422453703703703 | 49.972 |
| 0.2142361111111111 | 49.969 |
| 0.2142476851851852 | 49.966 |
| 0.21425925925925926 | 49.966 |
| 0.21427083333333333 | 49.967 |
| 0.21428240740740742 | 49.966 |
| 0.2142939814814815 | 49.966 |
| 0.21430555555555555 | 49.966 |
| 0.21431712962962965 | 49.967 |
| 0.21432870370370372 | 49.967 |
| 0.21434027777777778 | 49.969 |
| 0.21435185185185188 | 49.968 |
| 0.21436342592592594 | 49.966 |
| 0.21437499999999998 | 49.964 |
| 0.21438657407407405 | 49.962 |
| 0.21439814814814814 | 49.959 |
| 0.2144097222222222 | 49.96 |
| 0.21442129629629628 | 49.959 |
| 0.21443287037037037 | 49.959 |
| 0.21444444444444444 | 49.959 |
| 0.2144560185185185 | 49.958 |
| 0.2144675925925926 | 49.958 |
| 0.21447916666666667 | 49.957 |
| 0.21449074074074073 | 49.957 |
| 0.21450231481481483 | 49.955 |
| 0.2145138888888889 | 49.956 |
| 0.21452546296296296 | 49.956 |
| 0.21453703703703705 | 49.956 |
| 0.21454861111111112 | 49.955 |
| 0.2145601851851852 | 49.954 |
| 0.21457175925925928 | 49.954 |
| 0.21458333333333335 | 49.952 |
| 0.21459490740740741 | 49.952 |
| 0.2146064814814815 | 49.953 |
| 0.21461805555555555 | 49.952 |
| 0.21462962962962961 | 49.95 |
| 0.21464120370370368 | 49.95 |
| 0.21465277777777778 | 49.947 |
| 0.21466435185185184 | 49.946 |
| 0.2146759259259259 | 49.945 |
| 0.2146875 | 49.942 |
| 0.21469907407407407 | 49.944 |
| 0.21471064814814814 | 49.943 |
| 0.21472222222222223 | 49.945 |
| 0.2147337962962963 | 49.948 |
| 0.21474537037037036 | 49.95 |
| 0.21475694444444446 | 49.952 |
| 0.21476851851851853 | 49.956 |
| 0.2147800925925926 | 49.957 |
| 0.2147916666666667 | 49.96 |
| 0.21480324074074075 | 49.964 |
| 0.21481481481481482 | 49.966 |
| 0.21482638888888891 | 49.967 |
| 0.21483796296296298 | 49.969 |
| 0.21484953703703702 | 49.97 |
| 0.21486111111111109 | 49.971 |
| 0.21487268518518518 | 49.973 |
| 0.21488425925925925 | 49.974 |
| 0.2148958333333333 | 49.977 |
| 0.2149074074074074 | 49.979 |
| 0.21491898148148147 | 49.983 |
| 0.21493055555555554 | 49.983 |
| 0.21494212962962964 | 49.982 |
| 0.2149537037037037 | 49.979 |
| 0.21496527777777777 | 49.978 |
| 0.21497685185185186 | 49.974 |
| 0.21498842592592593 | 49.974 |
| 0.215 | 49.972 |
| 0.2150115740740741 | 49.972 |
| 0.21502314814814816 | 49.972 |
| 0.21503472222222222 | 49.974 |
| 0.21504629629629632 | 49.976 |
| 0.21505787037037039 | 49.979 |
| 0.21506944444444445 | 49.979 |
| 0.2150810185185185 | 49.979 |
| 0.21509259259259259 | 49.981 |
| 0.21510416666666665 | 49.978 |
| 0.21511574074074072 | 49.98 |
| 0.2151273148148148 | 49.982 |
| 0.21513888888888888 | 49.985 |
| 0.21515046296296295 | 49.988 |
| 0.21516203703703704 | 49.988 |
| 0.2151736111111111 | 49.988 |
| 0.21518518518518517 | 49.988 |
| 0.21519675925925927 | 49.988 |
| 0.21520833333333333 | 49.988 |
| 0.2152199074074074 | 49.988 |
| 0.2152314814814815 | 49.985 |
| 0.21524305555555556 | 49.982 |
| 0.21525462962962963 | 49.982 |
| 0.21526620370370372 | 49.981 |
| 0.2152777777777778 | 49.979 |
| 0.21528935185185186 | 49.976 |
| 0.21530092592592595 | 49.973 |
| 0.21531250000000002 | 49.971 |
| 0.21532407407407406 | 49.971 |
| 0.21533564814814812 | 49.973 |
| 0.21534722222222222 | 49.973 |
| 0.21535879629629628 | 49.974 |
| 0.21537037037037035 | 49.973 |
| 0.21538194444444445 | 49.974 |
| 0.2153935185185185 | 49.973 |
| 0.21540509259259258 | 49.974 |
| 0.21541666666666667 | 49.977 |
| 0.21542824074074074 | 49.974 |
| 0.2154398148148148 | 49.967 |
| 0.2154513888888889 | 49.959 |
| 0.21546296296296297 | 49.953 |
| 0.21547453703703703 | 49.941 |
| 0.21548611111111113 | 49.93 |
| 0.2154976851851852 | 49.923 |
| 0.21550925925925926 | 49.916 |
| 0.21552083333333336 | 49.912 |
| 0.21553240740740742 | 49.911 |
| 0.2155439814814815 | 49.912 |
| 0.21555555555555558 | 49.908 |
| 0.21556712962962962 | 49.91 |
| 0.2155787037037037 | 49.914 |
| 0.21559027777777776 | 49.915 |
| 0.21560185185185185 | 49.92 |
| 0.21561342592592592 | 49.92 |
| 0.21562499999999998 | 49.921 |
| 0.21563657407407408 | 49.921 |
| 0.21564814814814814 | 49.92 |
| 0.2156597222222222 | 49.922 |
| 0.2156712962962963 | 49.922 |
| 0.21568287037037037 | 49.925 |
| 0.21569444444444444 | 49.923 |
| 0.21570601851851853 | 49.92 |
| 0.2157175925925926 | 49.92 |
| 0.21572916666666667 | 49.922 |
| 0.21574074074074076 | 49.921 |
| 0.21575231481481483 | 49.923 |
| 0.2157638888888889 | 49.926 |
| 0.215775462962963 | 49.927 |
| 0.21578703703703703 | 49.926 |
| 0.2157986111111111 | 49.923 |
| 0.21581018518518516 | 49.921 |
| 0.21582175925925925 | 49.92 |
| 0.21583333333333332 | 49.922 |
| 0.2158449074074074 | 49.926 |
| 0.21585648148148148 | 49.929 |
| 0.21586805555555555 | 49.931 |
| 0.21587962962962962 | 49.933 |
| 0.2158912037037037 | 49.935 |
| 0.21590277777777778 | 49.935 |
| 0.21591435185185184 | 49.934 |
| 0.21592592592592594 | 49.933 |
| 0.2159375 | 49.933 |
| 0.21594907407407407 | 49.932 |
| 0.21596064814814817 | 49.931 |
| 0.21597222222222223 | 49.93 |
| 0.2159837962962963 | 49.931 |
| 0.2159953703703704 | 49.93 |
| 0.21600694444444446 | 49.929 |
| 0.21601851851851853 | 49.929 |
| 0.21603009259259257 | 49.927 |
| 0.21604166666666666 | 49.928 |
| 0.21605324074074073 | 49.928 |
| 0.2160648148148148 | 49.926 |
| 0.2160763888888889 | 49.928 |
| 0.21608796296296295 | 49.926 |
| 0.21609953703703702 | 49.929 |
| 0.21611111111111111 | 49.93 |
| 0.21612268518518518 | 49.931 |
| 0.21613425925925925 | 49.932 |
| 0.21614583333333334 | 49.932 |
| 0.2161574074074074 | 49.931 |
| 0.21616898148148148 | 49.93 |
| 0.21618055555555557 | 49.931 |
| 0.21619212962962964 | 49.932 |
| 0.2162037037037037 | 49.931 |
| 0.2162152777777778 | 49.929 |
| 0.21622685185185186 | 49.928 |
| 0.21623842592592593 | 49.925 |
| 0.21625000000000003 | 49.922 |
| 0.2162615740740741 | 49.919 |
| 0.21627314814814813 | 49.919 |
| 0.2162847222222222 | 49.921 |
| 0.2162962962962963 | 49.921 |
| 0.21630787037037036 | 49.923 |
| 0.21631944444444443 | 49.923 |
| 0.21633101851851852 | 49.924 |
| 0.2163425925925926 | 49.923 |
| 0.21635416666666665 | 49.922 |
| 0.21636574074074075 | 49.92 |
| 0.21637731481481481 | 49.92 |
| 0.21638888888888888 | 49.924 |
| 0.21640046296296298 | 49.928 |
| 0.21641203703703704 | 49.931 |
| 0.2164236111111111 | 49.935 |
| 0.2164351851851852 | 49.936 |
| 0.21644675925925927 | 49.937 |
| 0.21645833333333334 | 49.941 |
| 0.21646990740740743 | 49.943 |
| 0.2164814814814815 | 49.947 |
| 0.21649305555555556 | 49.949 |
| 0.21650462962962966 | 49.949 |
| 0.2165162037037037 | 49.95 |
| 0.21652777777777776 | 49.95 |
| 0.21653935185185183 | 49.95 |
| 0.21655092592592592 | 49.949 |
| 0.2165625 | 49.948 |
| 0.21657407407407406 | 49.947 |
| 0.21658564814814815 | 49.947 |
| 0.21659722222222222 | 49.946 |
| 0.21660879629629629 | 49.945 |
| 0.21662037037037038 | 49.943 |
| 0.21663194444444445 | 49.942 |
| 0.2166435185185185 | 49.938 |
| 0.2166550925925926 | 49.938 |
| 0.21666666666666667 | 49.938 |
| 0.21667824074074074 | 49.935 |
| 0.21668981481481484 | 49.933 |
| 0.2167013888888889 | 49.932 |
| 0.21671296296296297 | 49.929 |
| 0.21672453703703706 | 49.927 |
| 0.2167361111111111 | 49.927 |
| 0.21674768518518517 | 49.926 |
| 0.21675925925925923 | 49.925 |
| 0.21677083333333333 | 49.925 |
| 0.2167824074074074 | 49.922 |
| 0.21679398148148146 | 49.92 |
| 0.21680555555555556 | 49.921 |
| 0.21681712962962962 | 49.92 |
| 0.2168287037037037 | 49.919 |
| 0.21684027777777778 | 49.921 |
| 0.21685185185185185 | 49.924 |
| 0.21686342592592592 | 49.926 |
| 0.216875 | 49.928 |
| 0.21688657407407408 | 49.932 |
| 0.21689814814814815 | 49.932 |
| 0.21690972222222224 | 49.934 |
| 0.2169212962962963 | 49.935 |
| 0.21693287037037037 | 49.936 |
| 0.21694444444444447 | 49.94 |
| 0.21695601851851853 | 49.942 |
| 0.2169675925925926 | 49.947 |
| 0.21697916666666664 | 49.947 |
| 0.21699074074074073 | 49.949 |
| 0.2170023148148148 | 49.952 |
| 0.21701388888888887 | 49.953 |
| 0.21702546296296296 | 49.953 |
| 0.21703703703703703 | 49.954 |
| 0.2170486111111111 | 49.953 |
| 0.2170601851851852 | 49.954 |
| 0.21707175925925926 | 49.954 |
| 0.21708333333333332 | 49.957 |
| 0.21709490740740742 | 49.958 |
| 0.21710648148148148 | 49.956 |
| 0.21711805555555555 | 49.957 |
| 0.21712962962962964 | 49.954 |
| 0.2171412037037037 | 49.954 |
| 0.21715277777777778 | 49.954 |
| 0.21716435185185187 | 49.953 |
| 0.21717592592592594 | 49.95 |
| 0.2171875 | 49.948 |
| 0.2171990740740741 | 49.945 |
| 0.21721064814814817 | 49.943 |
| 0.2172222222222222 | 49.942 |
| 0.21723379629629627 | 49.941 |
| 0.21724537037037037 | 49.94 |
| 0.21725694444444443 | 49.941 |
| 0.2172685185185185 | 49.94 |
| 0.2172800925925926 | 49.939 |
| 0.21729166666666666 | 49.939 |
| 0.21730324074074073 | 49.938 |
| 0.21731481481481482 | 49.936 |
| 0.2173263888888889 | 49.934 |
| 0.21733796296296296 | 49.935 |
| 0.21734953703703705 | 49.932 |
| 0.21736111111111112 | 49.93 |
| 0.21737268518518518 | 49.931 |
| 0.21738425925925928 | 49.931 |
| 0.21739583333333334 | 49.93 |
| 0.2174074074074074 | 49.93 |
| 0.2174189814814815 | 49.93 |
| 0.21743055555555557 | 49.928 |
| 0.21744212962962964 | 49.926 |
| 0.21745370370370368 | 49.927 |
| 0.21746527777777777 | 49.927 |
| 0.21747685185185184 | 49.927 |
| 0.2174884259259259 | 49.927 |
| 0.2175 | 49.929 |
| 0.21751157407407407 | 49.929 |
| 0.21752314814814813 | 49.928 |
| 0.21753472222222223 | 49.928 |
| 0.2175462962962963 | 49.926 |
| 0.21755787037037036 | 49.924 |
| 0.21756944444444445 | 49.923 |
| 0.21758101851851852 | 49.919 |
| 0.2175925925925926 | 49.915 |
| 0.21760416666666668 | 49.913 |
| 0.21761574074074075 | 49.912 |
| 0.21762731481481482 | 49.912 |
| 0.2176388888888889 | 49.913 |
| 0.21765046296296298 | 49.909 |
| 0.21766203703703704 | 49.91 |
| 0.21767361111111114 | 49.91 |
| 0.21768518518518518 | 49.909 |
| 0.21769675925925924 | 49.912 |
| 0.2177083333333333 | 49.911 |
| 0.2177199074074074 | 49.913 |
| 0.21773148148148147 | 49.916 |
| 0.21774305555555554 | 49.92 |
| 0.21775462962962963 | 49.924 |
| 0.2177662037037037 | 49.928 |
| 0.21777777777777776 | 49.927 |
| 0.21778935185185186 | 49.929 |
| 0.21780092592592593 | 49.932 |
| 0.2178125 | 49.934 |
| 0.2178240740740741 | 49.935 |
| 0.21783564814814815 | 49.935 |
| 0.21784722222222222 | 49.935 |
| 0.21785879629629631 | 49.938 |
| 0.21787037037037038 | 49.943 |
| 0.21788194444444445 | 49.943 |
| 0.21789351851851854 | 49.944 |
| 0.2179050925925926 | 49.941 |
| 0.21791666666666668 | 49.944 |
| 0.21792824074074071 | 49.945 |
| 0.2179398148148148 | 49.947 |
| 0.21795138888888888 | 49.949 |
| 0.21796296296296294 | 49.949 |
| 0.21797453703703704 | 49.948 |
| 0.2179861111111111 | 49.947 |
| 0.21799768518518517 | 49.946 |
| 0.21800925925925926 | 49.946 |
| 0.21802083333333333 | 49.947 |
| 0.2180324074074074 | 49.949 |
| 0.2180439814814815 | 49.95 |
| 0.21805555555555556 | 49.95 |
| 0.21806712962962962 | 49.951 |
| 0.21807870370370372 | 49.949 |
| 0.21809027777777779 | 49.949 |
| 0.21810185185185185 | 49.946 |
| 0.21811342592592595 | 49.946 |
| 0.218125 | 49.946 |
| 0.21813657407407408 | 49.946 |
| 0.21814814814814817 | 49.948 |
| 0.21815972222222224 | 49.949 |
| 0.21817129629629628 | 49.95 |
| 0.21818287037037035 | 49.951 |
| 0.21819444444444444 | 49.95 |
| 0.2182060185185185 | 49.95 |
| 0.21821759259259257 | 49.953 |
| 0.21822916666666667 | 49.953 |
| 0.21824074074074074 | 49.955 |
| 0.2182523148148148 | 49.958 |
| 0.2182638888888889 | 49.958 |
| 0.21827546296296296 | 49.957 |
| 0.21828703703703703 | 49.956 |
| 0.21829861111111112 | 49.955 |
| 0.2183101851851852 | 49.951 |
| 0.21832175925925926 | 49.947 |
| 0.21833333333333335 | 49.943 |
| 0.21834490740740742 | 49.939 |
| 0.21835648148148148 | 49.936 |
| 0.21836805555555558 | 49.935 |
| 0.21837962962962965 | 49.933 |
| 0.21839120370370368 | 49.931 |
| 0.21840277777777775 | 49.932 |
| 0.21841435185185185 | 49.93 |
| 0.2184259259259259 | 49.931 |
| 0.21843749999999998 | 49.93 |
| 0.21844907407407407 | 49.931 |
| 0.21846064814814814 | 49.933 |
| 0.2184722222222222 | 49.935 |
| 0.2184837962962963 | 49.935 |
| 0.21849537037037037 | 49.936 |
| 0.21850694444444443 | 49.939 |
| 0.21851851851851853 | 49.938 |
| 0.2185300925925926 | 49.939 |
| 0.21854166666666666 | 49.939 |
| 0.21855324074074076 | 49.938 |
| 0.21856481481481482 | 49.939 |
| 0.2185763888888889 | 49.939 |
| 0.21858796296296298 | 49.94 |
| 0.21859953703703705 | 49.94 |
| 0.21861111111111112 | 49.94 |
| 0.2186226851851852 | 49.938 |
| 0.21863425925925925 | 49.936 |
| 0.21864583333333332 | 49.936 |
| 0.21865740740740738 | 49.935 |
| 0.21866898148148148 | 49.934 |
| 0.21868055555555554 | 49.933 |
| 0.2186921296296296 | 49.935 |
| 0.2187037037037037 | 49.936 |
| 0.21871527777777777 | 49.937 |
| 0.21872685185185184 | 49.94 |
| 0.21873842592592593 | 49.942 |
| 0.21875 | 49.943 |
| 0.21876157407407407 | 49.943 |
| 0.21877314814814816 | 49.946 |
| 0.21878472222222223 | 49.948 |
| 0.2187962962962963 | 49.948 |
| 0.2188078703703704 | 49.949 |
| 0.21881944444444446 | 49.948 |
| 0.21883101851851852 | 49.952 |
| 0.21884259259259262 | 49.955 |
| 0.21885416666666668 | 49.957 |
| 0.21886574074074075 | 49.956 |
| 0.2188773148148148 | 49.952 |
| 0.21888888888888888 | 49.95 |
| 0.21890046296296295 | 49.946 |
| 0.21891203703703702 | 49.944 |
| 0.2189236111111111 | 49.942 |
| 0.21893518518518518 | 49.941 |
| 0.21894675925925924 | 49.94 |
| 0.21895833333333334 | 49.939 |
| 0.2189699074074074 | 49.94 |
| 0.21898148148148147 | 49.941 |
| 0.21899305555555557 | 49.942 |
| 0.21900462962962963 | 49.944 |
| 0.2190162037037037 | 49.944 |
| 0.2190277777777778 | 49.947 |
| 0.21903935185185186 | 49.948 |
| 0.21905092592592593 | 49.951 |
| 0.21906250000000002 | 49.958 |
| 0.2190740740740741 | 49.964 |
| 0.21908564814814815 | 49.971 |
| 0.21909722222222225 | 49.974 |
| 0.21910879629629632 | 49.977 |
| 0.21912037037037035 | 49.977 |
| 0.21913194444444442 | 49.979 |
| 0.21914351851851852 | 49.98 |
| 0.21915509259259258 | 49.981 |
| 0.21916666666666665 | 49.981 |
| 0.21917824074074074 | 49.981 |
| 0.2191898148148148 | 49.979 |
| 0.21920138888888888 | 49.975 |
| 0.21921296296296297 | 49.974 |
| 0.21922453703703704 | 49.974 |
| 0.2192361111111111 | 49.975 |
| 0.2192476851851852 | 49.975 |
| 0.21925925925925926 | 49.975 |
| 0.21927083333333333 | 49.975 |
| 0.21928240740740743 | 49.976 |
| 0.2192939814814815 | 49.976 |
| 0.21930555555555556 | 49.975 |
| 0.21931712962962965 | 49.973 |
| 0.21932870370370372 | 49.969 |
| 0.21934027777777776 | 49.967 |
| 0.21935185185185183 | 49.963 |
| 0.21936342592592592 | 49.965 |
| 0.219375 | 49.965 |
| 0.21938657407407405 | 49.965 |
| 0.21939814814814815 | 49.964 |
| 0.21940972222222221 | 49.964 |
| 0.21942129629629628 | 49.963 |
| 0.21943287037037038 | 49.963 |
| 0.21944444444444444 | 49.963 |
| 0.2194560185185185 | 49.963 |
| 0.2194675925925926 | 49.963 |
| 0.21947916666666667 | 49.963 |
| 0.21949074074074074 | 49.962 |
| 0.21950231481481483 | 49.96 |
| 0.2195138888888889 | 49.961 |
| 0.21952546296296296 | 49.964 |
| 0.21953703703703706 | 49.966 |
| 0.21954861111111112 | 49.969 |
| 0.2195601851851852 | 49.971 |
| 0.21957175925925929 | 49.971 |
| 0.21958333333333332 | 49.971 |
| 0.2195949074074074 | 49.97 |
| 0.21960648148148146 | 49.968 |
| 0.21961805555555555 | 49.966 |
| 0.21962962962962962 | 49.962 |
| 0.21964120370370369 | 49.958 |
| 0.21965277777777778 | 49.955 |
| 0.21966435185185185 | 49.951 |
| 0.2196759259259259 | 49.947 |
| 0.2196875 | 49.944 |
| 0.21969907407407407 | 49.945 |
| 0.21971064814814814 | 49.945 |
| 0.21972222222222224 | 49.947 |
| 0.2197337962962963 | 49.949 |
| 0.21974537037037037 | 49.95 |
| 0.21975694444444446 | 49.95 |
| 0.21976851851851853 | 49.95 |
| 0.2197800925925926 | 49.951 |
| 0.2197916666666667 | 49.951 |
| 0.21980324074074076 | 49.951 |
| 0.21981481481481482 | 49.952 |
| 0.21982638888888886 | 49.953 |
| 0.21983796296296296 | 49.952 |
| 0.21984953703703702 | 49.953 |
| 0.2198611111111111 | 49.952 |
| 0.21987268518518518 | 49.952 |
| 0.21988425925925925 | 49.952 |
| 0.21989583333333332 | 49.951 |
| 0.2199074074074074 | 49.949 |
| 0.21991898148148148 | 49.948 |
| 0.21993055555555555 | 49.949 |
| 0.21994212962962964 | 49.949 |
| 0.2199537037037037 | 49.949 |
| 0.21996527777777777 | 49.948 |
| 0.21997685185185187 | 49.949 |
| 0.21998842592592593 | 49.948 |
| 0.22 | 49.948 |
| 0.2200115740740741 | 49.947 |
| 0.22002314814814816 | 49.944 |
| 0.22003472222222223 | 49.943 |
| 0.22004629629629632 | 49.941 |
| 0.22005787037037036 | 49.94 |
| 0.22006944444444443 | 49.939 |
| 0.2200810185185185 | 49.94 |
| 0.2200925925925926 | 49.94 |
| 0.22010416666666666 | 49.941 |
| 0.22011574074074072 | 49.941 |
| 0.22012731481481482 | 49.943 |
| 0.22013888888888888 | 49.943 |
| 0.22015046296296295 | 49.944 |
| 0.22016203703703704 | 49.945 |
| 0.2201736111111111 | 49.946 |
| 0.22018518518518518 | 49.948 |
| 0.22019675925925927 | 49.948 |
| 0.22020833333333334 | 49.949 |
| 0.2202199074074074 | 49.949 |
| 0.2202314814814815 | 49.948 |
| 0.22024305555555557 | 49.948 |
| 0.22025462962962963 | 49.945 |
| 0.22026620370370373 | 49.945 |
| 0.2202777777777778 | 49.942 |
| 0.22028935185185183 | 49.941 |
| 0.2203009259259259 | 49.939 |
| 0.2203125 | 49.937 |
| 0.22032407407407406 | 49.935 |
| 0.22033564814814813 | 49.933 |
| 0.22034722222222222 | 49.933 |
| 0.2203587962962963 | 49.933 |
| 0.22037037037037036 | 49.932 |
| 0.22038194444444445 | 49.932 |
| 0.22039351851851852 | 49.932 |
| 0.22040509259259258 | 49.932 |
| 0.22041666666666668 | 49.933 |
| 0.22042824074074074 | 49.935 |
| 0.2204398148148148 | 49.938 |
| 0.2204513888888889 | 49.939 |
| 0.22046296296296297 | 49.94 |
| 0.22047453703703704 | 49.943 |
| 0.22048611111111113 | 49.942 |
| 0.2204976851851852 | 49.942 |
| 0.22050925925925927 | 49.939 |
| 0.22052083333333336 | 49.938 |
| 0.2205324074074074 | 49.938 |
| 0.22054398148148147 | 49.939 |
| 0.22055555555555553 | 49.941 |
| 0.22056712962962963 | 49.94 |
| 0.2205787037037037 | 49.939 |
| 0.22059027777777776 | 49.939 |
| 0.22060185185185185 | 49.937 |
| 0.22061342592592592 | 49.935 |
| 0.220625 | 49.934 |
| 0.22063657407407408 | 49.933 |
| 0.22064814814814815 | 49.932 |
| 0.22065972222222222 | 49.931 |
| 0.2206712962962963 | 49.931 |
| 0.22068287037037038 | 49.929 |
| 0.22069444444444444 | 49.928 |
| 0.22070601851851854 | 49.928 |
| 0.2207175925925926 | 49.928 |
| 0.22072916666666667 | 49.928 |
| 0.22074074074074077 | 49.927 |
| 0.22075231481481483 | 49.928 |
| 0.22076388888888887 | 49.929 |
| 0.22077546296296294 | 49.931 |
| 0.22078703703703703 | 49.934 |
| 0.2207986111111111 | 49.936 |
| 0.22081018518518516 | 49.937 |
| 0.22082175925925926 | 49.936 |
| 0.22083333333333333 | 49.939 |
| 0.2208449074074074 | 49.939 |
| 0.2208564814814815 | 49.939 |
| 0.22086805555555555 | 49.94 |
| 0.22087962962962962 | 49.943 |
| 0.22089120370370371 | 49.945 |
| 0.22090277777777778 | 49.945 |
| 0.22091435185185185 | 49.945 |
| 0.22092592592592594 | 49.945 |
| 0.2209375 | 49.945 |
| 0.22094907407407408 | 49.945 |
| 0.22096064814814817 | 49.945 |
| 0.22097222222222224 | 49.945 |
| 0.2209837962962963 | 49.944 |
| 0.2209953703703704 | 49.945 |
| 0.22100694444444444 | 49.943 |
| 0.2210185185185185 | 49.943 |
| 0.22103009259259257 | 49.943 |
| 0.22104166666666666 | 49.941 |
| 0.22105324074074073 | 49.941 |
| 0.2210648148148148 | 49.939 |
| 0.2210763888888889 | 49.942 |
| 0.22108796296296296 | 49.943 |
| 0.22109953703703702 | 49.946 |
| 0.22111111111111112 | 49.949 |
| 0.22112268518518519 | 49.953 |
| 0.22113425925925925 | 49.954 |
| 0.22114583333333335 | 49.955 |
| 0.2211574074074074 | 49.957 |
| 0.22116898148148148 | 49.956 |
| 0.22118055555555557 | 49.955 |
| 0.22119212962962964 | 49.953 |
| 0.2212037037037037 | 49.952 |
| 0.2212152777777778 | 49.949 |
| 0.22122685185185187 | 49.947 |
| 0.2212384259259259 | 49.946 |
| 0.22124999999999997 | 49.943 |
| 0.22126157407407407 | 49.943 |
| 0.22127314814814814 | 49.943 |
| 0.2212847222222222 | 49.944 |
| 0.2212962962962963 | 49.944 |
| 0.22130787037037036 | 49.944 |
| 0.22131944444444443 | 49.944 |
| 0.22133101851851852 | 49.943 |
| 0.2213425925925926 | 49.945 |
| 0.22135416666666666 | 49.945 |
| 0.22136574074074075 | 49.945 |
| 0.22137731481481482 | 49.944 |
| 0.22138888888888889 | 49.943 |
| 0.22140046296296298 | 49.943 |
| 0.22141203703703705 | 49.943 |
| 0.2214236111111111 | 49.945 |
| 0.2214351851851852 | 49.948 |
| 0.22144675925925927 | 49.95 |
| 0.22145833333333334 | 49.952 |
| 0.22146990740740743 | 49.953 |
| 0.22148148148148147 | 49.952 |
| 0.22149305555555554 | 49.952 |
| 0.2215046296296296 | 49.953 |
| 0.2215162037037037 | 49.956 |
| 0.22152777777777777 | 49.954 |
| 0.22153935185185183 | 49.954 |
| 0.22155092592592593 | 49.953 |
| 0.2215625 | 49.953 |
| 0.22157407407407406 | 49.953 |
| 0.22158564814814816 | 49.952 |
| 0.22159722222222222 | 49.95 |
| 0.2216087962962963 | 49.948 |
| 0.22162037037037038 | 49.945 |
| 0.22163194444444445 | 49.941 |
| 0.22164351851851852 | 49.937 |
| 0.2216550925925926 | 49.937 |
| 0.22166666666666668 | 49.935 |
| 0.22167824074074075 | 49.934 |
| 0.22168981481481484 | 49.935 |
| 0.2217013888888889 | 49.934 |
| 0.22171296296296295 | 49.936 |
| 0.221724537037037 | 49.94 |
| 0.2217361111111111 | 49.942 |
| 0.22174768518518517 | 49.943 |
| 0.22175925925925924 | 49.943 |
| 0.22177083333333333 | 49.942 |
| 0.2217824074074074 | 49.942 |
| 0.22179398148148147 | 49.942 |
| 0.22180555555555556 | 49.942 |
| 0.22181712962962963 | 49.942 |
| 0.2218287037037037 | 49.942 |
| 0.2218402777777778 | 49.941 |
| 0.22185185185185186 | 49.942 |
| 0.22186342592592592 | 49.945 |
| 0.22187500000000002 | 49.943 |
| 0.22188657407407408 | 49.943 |
| 0.22189814814814815 | 49.944 |
| 0.22190972222222224 | 49.943 |
| 0.2219212962962963 | 49.943 |
| 0.22193287037037038 | 49.944 |
| 0.22194444444444447 | 49.944 |
| 0.2219560185185185 | 49.944 |
| 0.22196759259259258 | 49.941 |
| 0.22197916666666664 | 49.937 |
| 0.22199074074074074 | 49.933 |
| 0.2220023148148148 | 49.929 |
| 0.22201388888888887 | 49.924 |
| 0.22202546296296297 | 49.924 |
| 0.22203703703703703 | 49.924 |
| 0.2220486111111111 | 49.924 |
| 0.2220601851851852 | 49.926 |
| 0.22207175925925926 | 49.925 |
| 0.22208333333333333 | 49.927 |
| 0.22209490740740742 | 49.927 |
| 0.2221064814814815 | 49.927 |
| 0.22211805555555555 | 49.927 |
| 0.22212962962962965 | 49.926 |
| 0.22214120370370372 | 49.926 |
| 0.22215277777777778 | 49.926 |
| 0.22216435185185188 | 49.931 |
| 0.22217592592592594 | 49.935 |
| 0.22218749999999998 | 49.939 |
| 0.22219907407407405 | 49.942 |
| 0.22221064814814814 | 49.943 |
| 0.2222222222222222 | 49.943 |
| 0.22223379629629628 | 49.945 |
| 0.22224537037037037 | 49.942 |
| 0.22225694444444444 | 49.941 |
| 0.2222685185185185 | 49.939 |
| 0.2222800925925926 | 49.935 |
| 0.22229166666666667 | 49.936 |
| 0.22230324074074073 | 49.935 |
| 0.22231481481481483 | 49.933 |
| 0.2223263888888889 | 49.931 |
| 0.22233796296296296 | 49.929 |
| 0.22234953703703705 | 49.928 |
| 0.22236111111111112 | 49.929 |
| 0.2223726851851852 | 49.927 |
| 0.22238425925925928 | 49.926 |
| 0.22239583333333335 | 49.928 |
| 0.22240740740740741 | 49.928 |
| 0.2224189814814815 | 49.928 |
| 0.22243055555555555 | 49.927 |
| 0.22244212962962961 | 49.927 |
| 0.22245370370370368 | 49.926 |
| 0.22246527777777778 | 49.926 |
| 0.22247685185185184 | 49.925 |
| 0.2224884259259259 | 49.927 |
| 0.2225 | 49.929 |
| 0.22251157407407407 | 49.929 |
| 0.22252314814814814 | 49.931 |
| 0.22253472222222223 | 49.932 |
| 0.2225462962962963 | 49.932 |
| 0.22255787037037036 | 49.931 |
| 0.22256944444444446 | 49.932 |
| 0.22258101851851853 | 49.933 |
| 0.2225925925925926 | 49.934 |
| 0.2226041666666667 | 49.934 |
| 0.22261574074074075 | 49.934 |
| 0.22262731481481482 | 49.931 |
| 0.22263888888888891 | 49.927 |
| 0.22265046296296298 | 49.925 |
| 0.22266203703703702 | 49.925 |
| 0.22267361111111109 | 49.926 |
| 0.22268518518518518 | 49.926 |
| 0.22269675925925925 | 49.928 |
| 0.2227083333333333 | 49.929 |
| 0.2227199074074074 | 49.929 |
| 0.22273148148148147 | 49.929 |
| 0.22274305555555554 | 49.93 |
| 0.22275462962962964 | 49.931 |
| 0.2227662037037037 | 49.934 |
| 0.22277777777777777 | 49.935 |
| 0.22278935185185186 | 49.936 |
| 0.22280092592592593 | 49.936 |
| 0.2228125 | 49.939 |
| 0.2228240740740741 | 49.942 |
| 0.22283564814814816 | 49.946 |
| 0.22284722222222222 | 49.949 |
| 0.22285879629629632 | 49.953 |
| 0.22287037037037039 | 49.958 |
| 0.22288194444444445 | 49.959 |
| 0.2228935185185185 | 49.961 |
| 0.22290509259259259 | 49.962 |